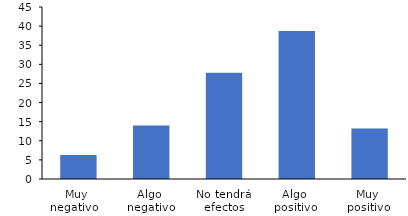
| Category | Series 0 |
|---|---|
| Muy 
negativo   | 6.3 |
| Algo 
negativo | 14 |
| No tendrá efectos | 27.8 |
| Algo 
positivo | 38.7 |
| Muy 
positivo | 13.2 |